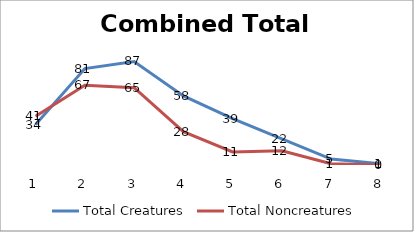
| Category | Total Creatures | Total Noncreatures |
|---|---|---|
| 0 | 34 | 41 |
| 1 | 81 | 67 |
| 2 | 87 | 65 |
| 3 | 58 | 28 |
| 4 | 39 | 11 |
| 5 | 22 | 12 |
| 6 | 5 | 1 |
| 7 | 1 | 0 |